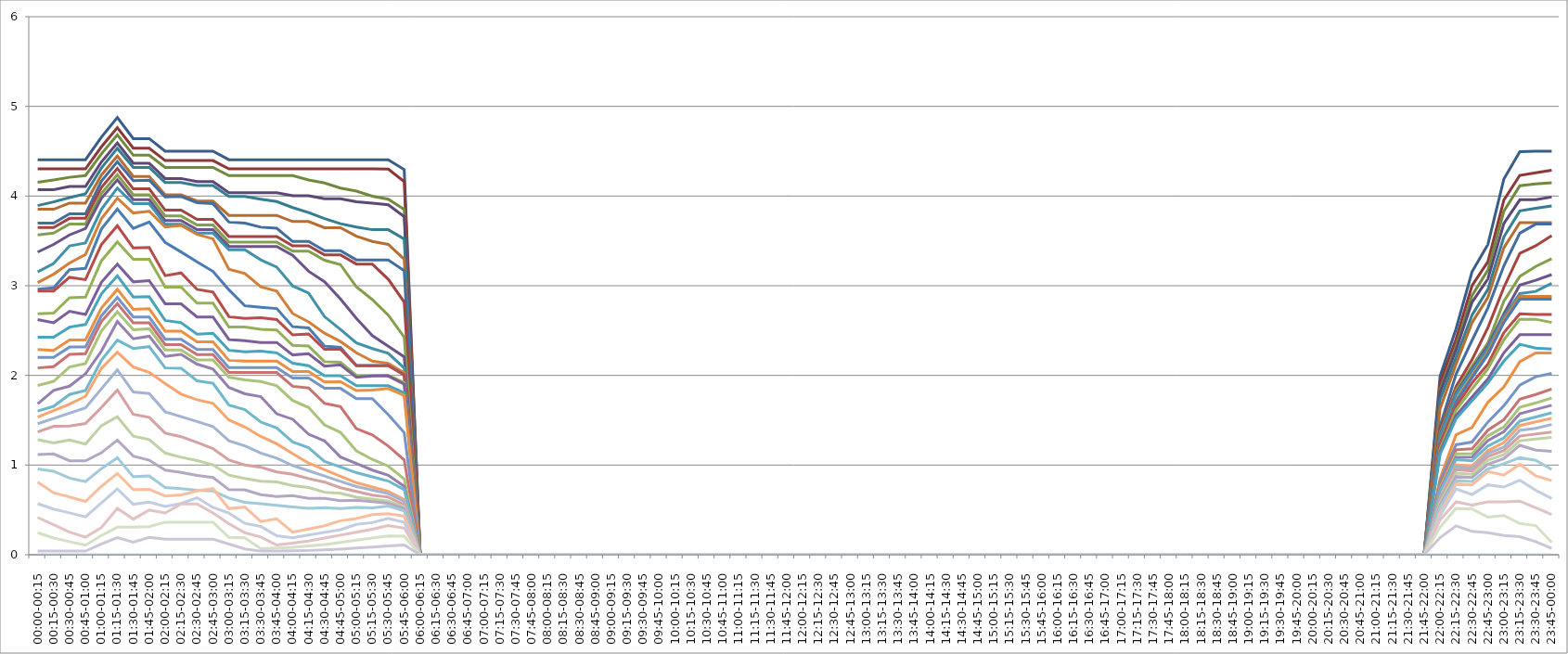
| Category | Series 0 | Series 1 | Series 2 | Series 3 | Series 4 | Series 5 | Series 6 | Series 7 | Series 8 | Series 9 | Series 10 | Series 11 | Series 12 | Series 13 | Series 14 | Series 15 | Series 16 | Series 17 | Series 18 | Series 19 | Series 20 | Series 21 | Series 22 | Series 23 | Series 24 | Series 25 | Series 26 | Series 27 | Series 28 | Series 29 | Series 30 | Series 31 | Series 32 | Series 33 | Series 34 |
|---|---|---|---|---|---|---|---|---|---|---|---|---|---|---|---|---|---|---|---|---|---|---|---|---|---|---|---|---|---|---|---|---|---|---|---|
| 00:00-00:15 | 4.405 | 4.303 | 4.152 | 4.072 | 3.894 | 3.853 | 3.699 | 3.65 | 3.568 | 3.375 | 3.154 | 3.035 | 2.962 | 2.941 | 2.686 | 2.623 | 2.427 | 2.289 | 2.201 | 2.083 | 1.886 | 1.681 | 1.602 | 1.535 | 1.461 | 1.37 | 1.283 | 1.116 | 0.958 | 0.809 | 0.569 | 0.416 | 0.245 | 0.04 | 0 |
| 00:15-00:30 | 4.405 | 4.303 | 4.18 | 4.072 | 3.934 | 3.853 | 3.699 | 3.65 | 3.587 | 3.46 | 3.248 | 3.128 | 2.977 | 2.941 | 2.694 | 2.587 | 2.427 | 2.278 | 2.201 | 2.098 | 1.934 | 1.833 | 1.655 | 1.608 | 1.52 | 1.433 | 1.246 | 1.124 | 0.932 | 0.692 | 0.51 | 0.334 | 0.186 | 0.04 | 0 |
| 00:30-00:45 | 4.405 | 4.303 | 4.209 | 4.106 | 3.983 | 3.922 | 3.801 | 3.752 | 3.688 | 3.567 | 3.444 | 3.254 | 3.179 | 3.094 | 2.866 | 2.715 | 2.538 | 2.395 | 2.316 | 2.234 | 2.093 | 1.88 | 1.787 | 1.68 | 1.579 | 1.437 | 1.281 | 1.048 | 0.854 | 0.643 | 0.466 | 0.251 | 0.146 | 0.04 | 0 |
| 00:45-01:00 | 4.405 | 4.303 | 4.229 | 4.106 | 4.024 | 3.922 | 3.801 | 3.752 | 3.688 | 3.638 | 3.476 | 3.347 | 3.193 | 3.068 | 2.873 | 2.679 | 2.567 | 2.395 | 2.316 | 2.242 | 2.132 | 2.018 | 1.832 | 1.767 | 1.638 | 1.463 | 1.234 | 1.046 | 0.815 | 0.595 | 0.423 | 0.196 | 0.106 | 0.04 | 0 |
| 01:00-01:15 | 4.656 | 4.549 | 4.471 | 4.381 | 4.312 | 4.234 | 4.165 | 4.096 | 4.028 | 3.974 | 3.853 | 3.747 | 3.632 | 3.459 | 3.278 | 3.039 | 2.909 | 2.751 | 2.665 | 2.6 | 2.496 | 2.27 | 2.17 | 2.078 | 1.85 | 1.642 | 1.44 | 1.137 | 0.96 | 0.763 | 0.577 | 0.303 | 0.215 | 0.12 | 0 |
| 01:15-01:30 | 4.876 | 4.763 | 4.682 | 4.591 | 4.532 | 4.448 | 4.382 | 4.307 | 4.238 | 4.18 | 4.09 | 3.977 | 3.854 | 3.67 | 3.488 | 3.241 | 3.111 | 2.959 | 2.869 | 2.801 | 2.711 | 2.602 | 2.393 | 2.26 | 2.062 | 1.837 | 1.539 | 1.279 | 1.082 | 0.906 | 0.734 | 0.518 | 0.307 | 0.19 | 0 |
| 01:30-01:45 | 4.641 | 4.533 | 4.456 | 4.366 | 4.32 | 4.219 | 4.173 | 4.081 | 4.013 | 3.959 | 3.915 | 3.811 | 3.639 | 3.422 | 3.296 | 3.043 | 2.873 | 2.736 | 2.65 | 2.586 | 2.509 | 2.409 | 2.3 | 2.094 | 1.815 | 1.565 | 1.322 | 1.101 | 0.87 | 0.727 | 0.563 | 0.397 | 0.309 | 0.14 | 0 |
| 01:45-02:00 | 4.641 | 4.533 | 4.456 | 4.366 | 4.32 | 4.219 | 4.177 | 4.081 | 4.013 | 3.959 | 3.915 | 3.831 | 3.71 | 3.426 | 3.296 | 3.057 | 2.877 | 2.744 | 2.65 | 2.586 | 2.52 | 2.437 | 2.32 | 2.036 | 1.798 | 1.532 | 1.285 | 1.055 | 0.879 | 0.73 | 0.586 | 0.498 | 0.313 | 0.194 | 0 |
| 02:00-02:15 | 4.499 | 4.395 | 4.319 | 4.196 | 4.152 | 4.013 | 3.99 | 3.842 | 3.778 | 3.726 | 3.685 | 3.654 | 3.483 | 3.113 | 2.985 | 2.799 | 2.613 | 2.492 | 2.404 | 2.344 | 2.283 | 2.212 | 2.083 | 1.908 | 1.595 | 1.356 | 1.135 | 0.943 | 0.75 | 0.655 | 0.539 | 0.465 | 0.363 | 0.174 | 0 |
| 02:15-02:30 | 4.499 | 4.395 | 4.319 | 4.196 | 4.152 | 4.013 | 3.995 | 3.842 | 3.778 | 3.726 | 3.685 | 3.673 | 3.377 | 3.143 | 2.985 | 2.799 | 2.588 | 2.492 | 2.404 | 2.344 | 2.283 | 2.234 | 2.08 | 1.791 | 1.54 | 1.317 | 1.088 | 0.917 | 0.737 | 0.667 | 0.572 | 0.566 | 0.363 | 0.174 | 0 |
| 02:30-02:45 | 4.499 | 4.395 | 4.319 | 4.162 | 4.118 | 3.945 | 3.926 | 3.74 | 3.677 | 3.626 | 3.586 | 3.572 | 3.267 | 2.959 | 2.806 | 2.652 | 2.459 | 2.375 | 2.289 | 2.231 | 2.173 | 2.126 | 1.94 | 1.729 | 1.485 | 1.253 | 1.05 | 0.885 | 0.718 | 0.711 | 0.636 | 0.566 | 0.363 | 0.174 | 0 |
| 02:45-03:00 | 4.499 | 4.395 | 4.319 | 4.162 | 4.118 | 3.945 | 3.915 | 3.74 | 3.677 | 3.626 | 3.586 | 3.523 | 3.16 | 2.929 | 2.806 | 2.652 | 2.469 | 2.375 | 2.289 | 2.231 | 2.173 | 2.071 | 1.913 | 1.689 | 1.43 | 1.184 | 1.003 | 0.862 | 0.712 | 0.738 | 0.528 | 0.465 | 0.363 | 0.174 | 0 |
| 03:00-03:15 | 4.405 | 4.303 | 4.229 | 4.038 | 3.995 | 3.784 | 3.71 | 3.548 | 3.486 | 3.438 | 3.4 | 3.184 | 2.954 | 2.654 | 2.539 | 2.4 | 2.281 | 2.168 | 2.086 | 2.032 | 1.979 | 1.865 | 1.668 | 1.503 | 1.27 | 1.055 | 0.888 | 0.726 | 0.632 | 0.514 | 0.464 | 0.346 | 0.193 | 0.119 | 0 |
| 03:15-03:30 | 4.405 | 4.303 | 4.229 | 4.038 | 3.995 | 3.784 | 3.699 | 3.548 | 3.486 | 3.438 | 3.4 | 3.136 | 2.777 | 2.635 | 2.539 | 2.386 | 2.262 | 2.161 | 2.086 | 2.032 | 1.951 | 1.795 | 1.618 | 1.425 | 1.214 | 1.002 | 0.85 | 0.723 | 0.585 | 0.532 | 0.35 | 0.246 | 0.189 | 0.065 | 0 |
| 03:30-03:45 | 4.405 | 4.303 | 4.229 | 4.038 | 3.965 | 3.784 | 3.653 | 3.548 | 3.486 | 3.438 | 3.289 | 2.988 | 2.76 | 2.643 | 2.514 | 2.368 | 2.27 | 2.161 | 2.086 | 2.032 | 1.931 | 1.763 | 1.479 | 1.319 | 1.134 | 0.976 | 0.82 | 0.67 | 0.568 | 0.37 | 0.316 | 0.198 | 0.066 | 0.04 | 0 |
| 03:45-04:00 | 4.405 | 4.303 | 4.229 | 4.038 | 3.939 | 3.784 | 3.642 | 3.548 | 3.486 | 3.438 | 3.208 | 2.939 | 2.746 | 2.623 | 2.506 | 2.368 | 2.251 | 2.161 | 2.086 | 2.032 | 1.884 | 1.572 | 1.413 | 1.238 | 1.077 | 0.923 | 0.812 | 0.65 | 0.551 | 0.4 | 0.212 | 0.108 | 0.074 | 0.04 | 0 |
| 04:00-04:15 | 4.405 | 4.303 | 4.229 | 4.004 | 3.872 | 3.716 | 3.493 | 3.446 | 3.385 | 3.338 | 2.998 | 2.69 | 2.543 | 2.452 | 2.334 | 2.228 | 2.137 | 2.043 | 1.971 | 1.879 | 1.721 | 1.511 | 1.259 | 1.129 | 0.995 | 0.898 | 0.771 | 0.659 | 0.533 | 0.251 | 0.189 | 0.13 | 0.082 | 0.044 | 0 |
| 04:15-04:30 | 4.405 | 4.303 | 4.18 | 4.004 | 3.815 | 3.716 | 3.493 | 3.446 | 3.385 | 3.161 | 2.918 | 2.597 | 2.529 | 2.463 | 2.327 | 2.243 | 2.108 | 2.043 | 1.971 | 1.86 | 1.642 | 1.344 | 1.194 | 1.021 | 0.937 | 0.85 | 0.75 | 0.629 | 0.516 | 0.287 | 0.219 | 0.152 | 0.098 | 0.048 | 0 |
| 04:30-04:45 | 4.405 | 4.303 | 4.146 | 3.97 | 3.748 | 3.647 | 3.391 | 3.343 | 3.284 | 3.045 | 2.655 | 2.471 | 2.327 | 2.291 | 2.155 | 2.103 | 1.996 | 1.926 | 1.856 | 1.688 | 1.447 | 1.27 | 1.041 | 0.949 | 0.878 | 0.81 | 0.697 | 0.627 | 0.525 | 0.323 | 0.25 | 0.185 | 0.114 | 0.056 | 0 |
| 04:45-05:00 | 4.405 | 4.303 | 4.089 | 3.97 | 3.692 | 3.647 | 3.391 | 3.343 | 3.235 | 2.853 | 2.513 | 2.378 | 2.312 | 2.291 | 2.147 | 2.118 | 1.996 | 1.93 | 1.856 | 1.651 | 1.365 | 1.09 | 0.978 | 0.876 | 0.819 | 0.748 | 0.685 | 0.603 | 0.514 | 0.379 | 0.28 | 0.218 | 0.138 | 0.063 | 0 |
| 05:00-05:15 | 4.405 | 4.303 | 4.055 | 3.936 | 3.655 | 3.552 | 3.288 | 3.241 | 2.987 | 2.635 | 2.361 | 2.252 | 2.11 | 2.108 | 2 | 1.979 | 1.885 | 1.831 | 1.741 | 1.406 | 1.158 | 1.017 | 0.915 | 0.804 | 0.76 | 0.706 | 0.642 | 0.609 | 0.528 | 0.403 | 0.338 | 0.251 | 0.162 | 0.075 | 0 |
| 05:15-05:30 | 4.405 | 4.303 | 3.998 | 3.922 | 3.625 | 3.495 | 3.288 | 3.241 | 2.845 | 2.443 | 2.299 | 2.159 | 2.11 | 2.108 | 2 | 1.993 | 1.885 | 1.835 | 1.741 | 1.336 | 1.063 | 0.944 | 0.868 | 0.755 | 0.721 | 0.664 | 0.62 | 0.591 | 0.523 | 0.446 | 0.358 | 0.284 | 0.186 | 0.086 | 0 |
| 05:30-05:45 | 4.405 | 4.3 | 3.965 | 3.902 | 3.625 | 3.461 | 3.288 | 3.072 | 2.673 | 2.325 | 2.246 | 2.134 | 2.11 | 2.108 | 2.003 | 1.993 | 1.885 | 1.853 | 1.562 | 1.212 | 0.988 | 0.887 | 0.822 | 0.707 | 0.681 | 0.643 | 0.598 | 0.574 | 0.543 | 0.458 | 0.406 | 0.325 | 0.21 | 0.098 | 0 |
| 05:45-06:00 | 4.296 | 4.162 | 3.851 | 3.771 | 3.52 | 3.296 | 3.167 | 2.818 | 2.426 | 2.207 | 2.082 | 2.029 | 2.006 | 2.004 | 1.92 | 1.902 | 1.805 | 1.774 | 1.362 | 1.058 | 0.844 | 0.763 | 0.725 | 0.614 | 0.595 | 0.557 | 0.536 | 0.514 | 0.487 | 0.43 | 0.361 | 0.297 | 0.207 | 0.11 | 0 |
| 06:00-06:15 | 0 | 0 | 0 | 0 | 0 | 0 | 0 | 0 | 0 | 0 | 0 | 0 | 0 | 0 | 0 | 0 | 0 | 0 | 0 | 0 | 0 | 0 | 0 | 0 | 0 | 0 | 0 | 0 | 0 | 0 | 0 | 0 | 0 | 0 | 0 |
| 06:15-06:30 | 0 | 0 | 0 | 0 | 0 | 0 | 0 | 0 | 0 | 0 | 0 | 0 | 0 | 0 | 0 | 0 | 0 | 0 | 0 | 0 | 0 | 0 | 0 | 0 | 0 | 0 | 0 | 0 | 0 | 0 | 0 | 0 | 0 | 0 | 0 |
| 06:30-06:45 | 0 | 0 | 0 | 0 | 0 | 0 | 0 | 0 | 0 | 0 | 0 | 0 | 0 | 0 | 0 | 0 | 0 | 0 | 0 | 0 | 0 | 0 | 0 | 0 | 0 | 0 | 0 | 0 | 0 | 0 | 0 | 0 | 0 | 0 | 0 |
| 06:45-07:00 | 0 | 0 | 0 | 0 | 0 | 0 | 0 | 0 | 0 | 0 | 0 | 0 | 0 | 0 | 0 | 0 | 0 | 0 | 0 | 0 | 0 | 0 | 0 | 0 | 0 | 0 | 0 | 0 | 0 | 0 | 0 | 0 | 0 | 0 | 0 |
| 07:00-07:15 | 0 | 0 | 0 | 0 | 0 | 0 | 0 | 0 | 0 | 0 | 0 | 0 | 0 | 0 | 0 | 0 | 0 | 0 | 0 | 0 | 0 | 0 | 0 | 0 | 0 | 0 | 0 | 0 | 0 | 0 | 0 | 0 | 0 | 0 | 0 |
| 07:15-07:30 | 0 | 0 | 0 | 0 | 0 | 0 | 0 | 0 | 0 | 0 | 0 | 0 | 0 | 0 | 0 | 0 | 0 | 0 | 0 | 0 | 0 | 0 | 0 | 0 | 0 | 0 | 0 | 0 | 0 | 0 | 0 | 0 | 0 | 0 | 0 |
| 07:30-07:45 | 0 | 0 | 0 | 0 | 0 | 0 | 0 | 0 | 0 | 0 | 0 | 0 | 0 | 0 | 0 | 0 | 0 | 0 | 0 | 0 | 0 | 0 | 0 | 0 | 0 | 0 | 0 | 0 | 0 | 0 | 0 | 0 | 0 | 0 | 0 |
| 07:45-08:00 | 0 | 0 | 0 | 0 | 0 | 0 | 0 | 0 | 0 | 0 | 0 | 0 | 0 | 0 | 0 | 0 | 0 | 0 | 0 | 0 | 0 | 0 | 0 | 0 | 0 | 0 | 0 | 0 | 0 | 0 | 0 | 0 | 0 | 0 | 0 |
| 08:00-08:15 | 0 | 0 | 0 | 0 | 0 | 0 | 0 | 0 | 0 | 0 | 0 | 0 | 0 | 0 | 0 | 0 | 0 | 0 | 0 | 0 | 0 | 0 | 0 | 0 | 0 | 0 | 0 | 0 | 0 | 0 | 0 | 0 | 0 | 0 | 0 |
| 08:15-08:30 | 0 | 0 | 0 | 0 | 0 | 0 | 0 | 0 | 0 | 0 | 0 | 0 | 0 | 0 | 0 | 0 | 0 | 0 | 0 | 0 | 0 | 0 | 0 | 0 | 0 | 0 | 0 | 0 | 0 | 0 | 0 | 0 | 0 | 0 | 0 |
| 08:30-08:45 | 0 | 0 | 0 | 0 | 0 | 0 | 0 | 0 | 0 | 0 | 0 | 0 | 0 | 0 | 0 | 0 | 0 | 0 | 0 | 0 | 0 | 0 | 0 | 0 | 0 | 0 | 0 | 0 | 0 | 0 | 0 | 0 | 0 | 0 | 0 |
| 08:45-09:00 | 0 | 0 | 0 | 0 | 0 | 0 | 0 | 0 | 0 | 0 | 0 | 0 | 0 | 0 | 0 | 0 | 0 | 0 | 0 | 0 | 0 | 0 | 0 | 0 | 0 | 0 | 0 | 0 | 0 | 0 | 0 | 0 | 0 | 0 | 0 |
| 09:00-09:15 | 0 | 0 | 0 | 0 | 0 | 0 | 0 | 0 | 0 | 0 | 0 | 0 | 0 | 0 | 0 | 0 | 0 | 0 | 0 | 0 | 0 | 0 | 0 | 0 | 0 | 0 | 0 | 0 | 0 | 0 | 0 | 0 | 0 | 0 | 0 |
| 09:15-09:30 | 0 | 0 | 0 | 0 | 0 | 0 | 0 | 0 | 0 | 0 | 0 | 0 | 0 | 0 | 0 | 0 | 0 | 0 | 0 | 0 | 0 | 0 | 0 | 0 | 0 | 0 | 0 | 0 | 0 | 0 | 0 | 0 | 0 | 0 | 0 |
| 09:30-09:45 | 0 | 0 | 0 | 0 | 0 | 0 | 0 | 0 | 0 | 0 | 0 | 0 | 0 | 0 | 0 | 0 | 0 | 0 | 0 | 0 | 0 | 0 | 0 | 0 | 0 | 0 | 0 | 0 | 0 | 0 | 0 | 0 | 0 | 0 | 0 |
| 09:45-10:00 | 0 | 0 | 0 | 0 | 0 | 0 | 0 | 0 | 0 | 0 | 0 | 0 | 0 | 0 | 0 | 0 | 0 | 0 | 0 | 0 | 0 | 0 | 0 | 0 | 0 | 0 | 0 | 0 | 0 | 0 | 0 | 0 | 0 | 0 | 0 |
| 10:00-10:15 | 0 | 0 | 0 | 0 | 0 | 0 | 0 | 0 | 0 | 0 | 0 | 0 | 0 | 0 | 0 | 0 | 0 | 0 | 0 | 0 | 0 | 0 | 0 | 0 | 0 | 0 | 0 | 0 | 0 | 0 | 0 | 0 | 0 | 0 | 0 |
| 10:15-10:30 | 0 | 0 | 0 | 0 | 0 | 0 | 0 | 0 | 0 | 0 | 0 | 0 | 0 | 0 | 0 | 0 | 0 | 0 | 0 | 0 | 0 | 0 | 0 | 0 | 0 | 0 | 0 | 0 | 0 | 0 | 0 | 0 | 0 | 0 | 0 |
| 10:30-10:45 | 0 | 0 | 0 | 0 | 0 | 0 | 0 | 0 | 0 | 0 | 0 | 0 | 0 | 0 | 0 | 0 | 0 | 0 | 0 | 0 | 0 | 0 | 0 | 0 | 0 | 0 | 0 | 0 | 0 | 0 | 0 | 0 | 0 | 0 | 0 |
| 10:45-11:00 | 0 | 0 | 0 | 0 | 0 | 0 | 0 | 0 | 0 | 0 | 0 | 0 | 0 | 0 | 0 | 0 | 0 | 0 | 0 | 0 | 0 | 0 | 0 | 0 | 0 | 0 | 0 | 0 | 0 | 0 | 0 | 0 | 0 | 0 | 0 |
| 11:00-11:15 | 0 | 0 | 0 | 0 | 0 | 0 | 0 | 0 | 0 | 0 | 0 | 0 | 0 | 0 | 0 | 0 | 0 | 0 | 0 | 0 | 0 | 0 | 0 | 0 | 0 | 0 | 0 | 0 | 0 | 0 | 0 | 0 | 0 | 0 | 0 |
| 11:15-11:30 | 0 | 0 | 0 | 0 | 0 | 0 | 0 | 0 | 0 | 0 | 0 | 0 | 0 | 0 | 0 | 0 | 0 | 0 | 0 | 0 | 0 | 0 | 0 | 0 | 0 | 0 | 0 | 0 | 0 | 0 | 0 | 0 | 0 | 0 | 0 |
| 11:30-11:45 | 0 | 0 | 0 | 0 | 0 | 0 | 0 | 0 | 0 | 0 | 0 | 0 | 0 | 0 | 0 | 0 | 0 | 0 | 0 | 0 | 0 | 0 | 0 | 0 | 0 | 0 | 0 | 0 | 0 | 0 | 0 | 0 | 0 | 0 | 0 |
| 11:45-12:00 | 0 | 0 | 0 | 0 | 0 | 0 | 0 | 0 | 0 | 0 | 0 | 0 | 0 | 0 | 0 | 0 | 0 | 0 | 0 | 0 | 0 | 0 | 0 | 0 | 0 | 0 | 0 | 0 | 0 | 0 | 0 | 0 | 0 | 0 | 0 |
| 12:00-12:15 | 0 | 0 | 0 | 0 | 0 | 0 | 0 | 0 | 0 | 0 | 0 | 0 | 0 | 0 | 0 | 0 | 0 | 0 | 0 | 0 | 0 | 0 | 0 | 0 | 0 | 0 | 0 | 0 | 0 | 0 | 0 | 0 | 0 | 0 | 0 |
| 12:15-12:30 | 0 | 0 | 0 | 0 | 0 | 0 | 0 | 0 | 0 | 0 | 0 | 0 | 0 | 0 | 0 | 0 | 0 | 0 | 0 | 0 | 0 | 0 | 0 | 0 | 0 | 0 | 0 | 0 | 0 | 0 | 0 | 0 | 0 | 0 | 0 |
| 12:30-12:45 | 0 | 0 | 0 | 0 | 0 | 0 | 0 | 0 | 0 | 0 | 0 | 0 | 0 | 0 | 0 | 0 | 0 | 0 | 0 | 0 | 0 | 0 | 0 | 0 | 0 | 0 | 0 | 0 | 0 | 0 | 0 | 0 | 0 | 0 | 0 |
| 12:45-13:00 | 0 | 0 | 0 | 0 | 0 | 0 | 0 | 0 | 0 | 0 | 0 | 0 | 0 | 0 | 0 | 0 | 0 | 0 | 0 | 0 | 0 | 0 | 0 | 0 | 0 | 0 | 0 | 0 | 0 | 0 | 0 | 0 | 0 | 0 | 0 |
| 13:00-13:15 | 0 | 0 | 0 | 0 | 0 | 0 | 0 | 0 | 0 | 0 | 0 | 0 | 0 | 0 | 0 | 0 | 0 | 0 | 0 | 0 | 0 | 0 | 0 | 0 | 0 | 0 | 0 | 0 | 0 | 0 | 0 | 0 | 0 | 0 | 0 |
| 13:15-13:30 | 0 | 0 | 0 | 0 | 0 | 0 | 0 | 0 | 0 | 0 | 0 | 0 | 0 | 0 | 0 | 0 | 0 | 0 | 0 | 0 | 0 | 0 | 0 | 0 | 0 | 0 | 0 | 0 | 0 | 0 | 0 | 0 | 0 | 0 | 0 |
| 13:30-13:45 | 0 | 0 | 0 | 0 | 0 | 0 | 0 | 0 | 0 | 0 | 0 | 0 | 0 | 0 | 0 | 0 | 0 | 0 | 0 | 0 | 0 | 0 | 0 | 0 | 0 | 0 | 0 | 0 | 0 | 0 | 0 | 0 | 0 | 0 | 0 |
| 13:45-14:00 | 0 | 0 | 0 | 0 | 0 | 0 | 0 | 0 | 0 | 0 | 0 | 0 | 0 | 0 | 0 | 0 | 0 | 0 | 0 | 0 | 0 | 0 | 0 | 0 | 0 | 0 | 0 | 0 | 0 | 0 | 0 | 0 | 0 | 0 | 0 |
| 14:00-14:15 | 0 | 0 | 0 | 0 | 0 | 0 | 0 | 0 | 0 | 0 | 0 | 0 | 0 | 0 | 0 | 0 | 0 | 0 | 0 | 0 | 0 | 0 | 0 | 0 | 0 | 0 | 0 | 0 | 0 | 0 | 0 | 0 | 0 | 0 | 0 |
| 14:15-14:30 | 0 | 0 | 0 | 0 | 0 | 0 | 0 | 0 | 0 | 0 | 0 | 0 | 0 | 0 | 0 | 0 | 0 | 0 | 0 | 0 | 0 | 0 | 0 | 0 | 0 | 0 | 0 | 0 | 0 | 0 | 0 | 0 | 0 | 0 | 0 |
| 14:30-14:45 | 0 | 0 | 0 | 0 | 0 | 0 | 0 | 0 | 0 | 0 | 0 | 0 | 0 | 0 | 0 | 0 | 0 | 0 | 0 | 0 | 0 | 0 | 0 | 0 | 0 | 0 | 0 | 0 | 0 | 0 | 0 | 0 | 0 | 0 | 0 |
| 14:45-15:00 | 0 | 0 | 0 | 0 | 0 | 0 | 0 | 0 | 0 | 0 | 0 | 0 | 0 | 0 | 0 | 0 | 0 | 0 | 0 | 0 | 0 | 0 | 0 | 0 | 0 | 0 | 0 | 0 | 0 | 0 | 0 | 0 | 0 | 0 | 0 |
| 15:00-15:15 | 0 | 0 | 0 | 0 | 0 | 0 | 0 | 0 | 0 | 0 | 0 | 0 | 0 | 0 | 0 | 0 | 0 | 0 | 0 | 0 | 0 | 0 | 0 | 0 | 0 | 0 | 0 | 0 | 0 | 0 | 0 | 0 | 0 | 0 | 0 |
| 15:15-15:30 | 0 | 0 | 0 | 0 | 0 | 0 | 0 | 0 | 0 | 0 | 0 | 0 | 0 | 0 | 0 | 0 | 0 | 0 | 0 | 0 | 0 | 0 | 0 | 0 | 0 | 0 | 0 | 0 | 0 | 0 | 0 | 0 | 0 | 0 | 0 |
| 15:30-15:45 | 0 | 0 | 0 | 0 | 0 | 0 | 0 | 0 | 0 | 0 | 0 | 0 | 0 | 0 | 0 | 0 | 0 | 0 | 0 | 0 | 0 | 0 | 0 | 0 | 0 | 0 | 0 | 0 | 0 | 0 | 0 | 0 | 0 | 0 | 0 |
| 15:45-16:00 | 0 | 0 | 0 | 0 | 0 | 0 | 0 | 0 | 0 | 0 | 0 | 0 | 0 | 0 | 0 | 0 | 0 | 0 | 0 | 0 | 0 | 0 | 0 | 0 | 0 | 0 | 0 | 0 | 0 | 0 | 0 | 0 | 0 | 0 | 0 |
| 16:00-16:15 | 0 | 0 | 0 | 0 | 0 | 0 | 0 | 0 | 0 | 0 | 0 | 0 | 0 | 0 | 0 | 0 | 0 | 0 | 0 | 0 | 0 | 0 | 0 | 0 | 0 | 0 | 0 | 0 | 0 | 0 | 0 | 0 | 0 | 0 | 0 |
| 16:15-16:30 | 0 | 0 | 0 | 0 | 0 | 0 | 0 | 0 | 0 | 0 | 0 | 0 | 0 | 0 | 0 | 0 | 0 | 0 | 0 | 0 | 0 | 0 | 0 | 0 | 0 | 0 | 0 | 0 | 0 | 0 | 0 | 0 | 0 | 0 | 0 |
| 16:30-16:45 | 0 | 0 | 0 | 0 | 0 | 0 | 0 | 0 | 0 | 0 | 0 | 0 | 0 | 0 | 0 | 0 | 0 | 0 | 0 | 0 | 0 | 0 | 0 | 0 | 0 | 0 | 0 | 0 | 0 | 0 | 0 | 0 | 0 | 0 | 0 |
| 16:45-17:00 | 0 | 0 | 0 | 0 | 0 | 0 | 0 | 0 | 0 | 0 | 0 | 0 | 0 | 0 | 0 | 0 | 0 | 0 | 0 | 0 | 0 | 0 | 0 | 0 | 0 | 0 | 0 | 0 | 0 | 0 | 0 | 0 | 0 | 0 | 0 |
| 17:00-17:15 | 0 | 0 | 0 | 0 | 0 | 0 | 0 | 0 | 0 | 0 | 0 | 0 | 0 | 0 | 0 | 0 | 0 | 0 | 0 | 0 | 0 | 0 | 0 | 0 | 0 | 0 | 0 | 0 | 0 | 0 | 0 | 0 | 0 | 0 | 0 |
| 17:15-17:30 | 0 | 0 | 0 | 0 | 0 | 0 | 0 | 0 | 0 | 0 | 0 | 0 | 0 | 0 | 0 | 0 | 0 | 0 | 0 | 0 | 0 | 0 | 0 | 0 | 0 | 0 | 0 | 0 | 0 | 0 | 0 | 0 | 0 | 0 | 0 |
| 17:30-17:45 | 0 | 0 | 0 | 0 | 0 | 0 | 0 | 0 | 0 | 0 | 0 | 0 | 0 | 0 | 0 | 0 | 0 | 0 | 0 | 0 | 0 | 0 | 0 | 0 | 0 | 0 | 0 | 0 | 0 | 0 | 0 | 0 | 0 | 0 | 0 |
| 17:45-18:00 | 0 | 0 | 0 | 0 | 0 | 0 | 0 | 0 | 0 | 0 | 0 | 0 | 0 | 0 | 0 | 0 | 0 | 0 | 0 | 0 | 0 | 0 | 0 | 0 | 0 | 0 | 0 | 0 | 0 | 0 | 0 | 0 | 0 | 0 | 0 |
| 18:00-18:15 | 0 | 0 | 0 | 0 | 0 | 0 | 0 | 0 | 0 | 0 | 0 | 0 | 0 | 0 | 0 | 0 | 0 | 0 | 0 | 0 | 0 | 0 | 0 | 0 | 0 | 0 | 0 | 0 | 0 | 0 | 0 | 0 | 0 | 0 | 0 |
| 18:15-18:30 | 0 | 0 | 0 | 0 | 0 | 0 | 0 | 0 | 0 | 0 | 0 | 0 | 0 | 0 | 0 | 0 | 0 | 0 | 0 | 0 | 0 | 0 | 0 | 0 | 0 | 0 | 0 | 0 | 0 | 0 | 0 | 0 | 0 | 0 | 0 |
| 18:30-18:45 | 0 | 0 | 0 | 0 | 0 | 0 | 0 | 0 | 0 | 0 | 0 | 0 | 0 | 0 | 0 | 0 | 0 | 0 | 0 | 0 | 0 | 0 | 0 | 0 | 0 | 0 | 0 | 0 | 0 | 0 | 0 | 0 | 0 | 0 | 0 |
| 18:45-19:00 | 0 | 0 | 0 | 0 | 0 | 0 | 0 | 0 | 0 | 0 | 0 | 0 | 0 | 0 | 0 | 0 | 0 | 0 | 0 | 0 | 0 | 0 | 0 | 0 | 0 | 0 | 0 | 0 | 0 | 0 | 0 | 0 | 0 | 0 | 0 |
| 19:00-19:15 | 0 | 0 | 0 | 0 | 0 | 0 | 0 | 0 | 0 | 0 | 0 | 0 | 0 | 0 | 0 | 0 | 0 | 0 | 0 | 0 | 0 | 0 | 0 | 0 | 0 | 0 | 0 | 0 | 0 | 0 | 0 | 0 | 0 | 0 | 0 |
| 19:15-19:30 | 0 | 0 | 0 | 0 | 0 | 0 | 0 | 0 | 0 | 0 | 0 | 0 | 0 | 0 | 0 | 0 | 0 | 0 | 0 | 0 | 0 | 0 | 0 | 0 | 0 | 0 | 0 | 0 | 0 | 0 | 0 | 0 | 0 | 0 | 0 |
| 19:30-19:45 | 0 | 0 | 0 | 0 | 0 | 0 | 0 | 0 | 0 | 0 | 0 | 0 | 0 | 0 | 0 | 0 | 0 | 0 | 0 | 0 | 0 | 0 | 0 | 0 | 0 | 0 | 0 | 0 | 0 | 0 | 0 | 0 | 0 | 0 | 0 |
| 19:45-20:00 | 0 | 0 | 0 | 0 | 0 | 0 | 0 | 0 | 0 | 0 | 0 | 0 | 0 | 0 | 0 | 0 | 0 | 0 | 0 | 0 | 0 | 0 | 0 | 0 | 0 | 0 | 0 | 0 | 0 | 0 | 0 | 0 | 0 | 0 | 0 |
| 20:00-20:15 | 0 | 0 | 0 | 0 | 0 | 0 | 0 | 0 | 0 | 0 | 0 | 0 | 0 | 0 | 0 | 0 | 0 | 0 | 0 | 0 | 0 | 0 | 0 | 0 | 0 | 0 | 0 | 0 | 0 | 0 | 0 | 0 | 0 | 0 | 0 |
| 20:15-20:30 | 0 | 0 | 0 | 0 | 0 | 0 | 0 | 0 | 0 | 0 | 0 | 0 | 0 | 0 | 0 | 0 | 0 | 0 | 0 | 0 | 0 | 0 | 0 | 0 | 0 | 0 | 0 | 0 | 0 | 0 | 0 | 0 | 0 | 0 | 0 |
| 20:30-20:45 | 0 | 0 | 0 | 0 | 0 | 0 | 0 | 0 | 0 | 0 | 0 | 0 | 0 | 0 | 0 | 0 | 0 | 0 | 0 | 0 | 0 | 0 | 0 | 0 | 0 | 0 | 0 | 0 | 0 | 0 | 0 | 0 | 0 | 0 | 0 |
| 20:45-21:00 | 0 | 0 | 0 | 0 | 0 | 0 | 0 | 0 | 0 | 0 | 0 | 0 | 0 | 0 | 0 | 0 | 0 | 0 | 0 | 0 | 0 | 0 | 0 | 0 | 0 | 0 | 0 | 0 | 0 | 0 | 0 | 0 | 0 | 0 | 0 |
| 21:00-21:15 | 0 | 0 | 0 | 0 | 0 | 0 | 0 | 0 | 0 | 0 | 0 | 0 | 0 | 0 | 0 | 0 | 0 | 0 | 0 | 0 | 0 | 0 | 0 | 0 | 0 | 0 | 0 | 0 | 0 | 0 | 0 | 0 | 0 | 0 | 0 |
| 21:15-21:30 | 0 | 0 | 0 | 0 | 0 | 0 | 0 | 0 | 0 | 0 | 0 | 0 | 0 | 0 | 0 | 0 | 0 | 0 | 0 | 0 | 0 | 0 | 0 | 0 | 0 | 0 | 0 | 0 | 0 | 0 | 0 | 0 | 0 | 0 | 0 |
| 21:30-21:45 | 0 | 0 | 0 | 0 | 0 | 0 | 0 | 0 | 0 | 0 | 0 | 0 | 0 | 0 | 0 | 0 | 0 | 0 | 0 | 0 | 0 | 0 | 0 | 0 | 0 | 0 | 0 | 0 | 0 | 0 | 0 | 0 | 0 | 0 | 0 |
| 21:45-22:00 | 0 | 0 | 0 | 0 | 0 | 0 | 0 | 0 | 0 | 0 | 0 | 0 | 0 | 0 | 0 | 0 | 0 | 0 | 0 | 0 | 0 | 0 | 0 | 0 | 0 | 0 | 0 | 0 | 0 | 0 | 0 | 0 | 0 | 0 | 0 |
| 22:00-22:15 | 1.993 | 1.923 | 1.843 | 1.812 | 1.731 | 1.63 | 1.436 | 1.399 | 1.36 | 1.338 | 1.324 | 1.252 | 1.238 | 1.237 | 1.182 | 1.148 | 1.121 | 0.848 | 0.82 | 0.782 | 0.744 | 0.727 | 0.709 | 0.638 | 0.622 | 0.602 | 0.579 | 0.555 | 0.526 | 0.471 | 0.437 | 0.39 | 0.307 | 0.19 | 0 |
| 22:15-22:30 | 2.519 | 2.406 | 2.324 | 2.287 | 2.201 | 2.125 | 2.013 | 1.875 | 1.831 | 1.804 | 1.784 | 1.724 | 1.704 | 1.655 | 1.613 | 1.553 | 1.518 | 1.338 | 1.226 | 1.17 | 1.126 | 1.087 | 1.061 | 1.004 | 0.979 | 0.948 | 0.911 | 0.874 | 0.828 | 0.791 | 0.733 | 0.59 | 0.518 | 0.322 | 0 |
| 22:30-22:45 | 3.154 | 3 | 2.89 | 2.814 | 2.671 | 2.587 | 2.39 | 2.174 | 2.102 | 2.072 | 2.049 | 1.995 | 1.973 | 1.916 | 1.848 | 1.758 | 1.718 | 1.42 | 1.257 | 1.181 | 1.126 | 1.089 | 1.048 | 0.99 | 0.965 | 0.935 | 0.898 | 0.862 | 0.816 | 0.779 | 0.672 | 0.555 | 0.51 | 0.261 | 0 |
| 22:45-23:00 | 3.461 | 3.268 | 3.174 | 3.078 | 2.96 | 2.869 | 2.754 | 2.533 | 2.364 | 2.33 | 2.304 | 2.258 | 2.232 | 2.127 | 2.076 | 1.961 | 1.917 | 1.701 | 1.48 | 1.389 | 1.326 | 1.273 | 1.212 | 1.16 | 1.132 | 1.096 | 1.053 | 1.011 | 0.957 | 0.928 | 0.779 | 0.589 | 0.42 | 0.247 | 0 |
| 23:00-23:15 | 4.19 | 3.955 | 3.831 | 3.695 | 3.546 | 3.422 | 3.222 | 2.982 | 2.828 | 2.686 | 2.657 | 2.619 | 2.59 | 2.476 | 2.397 | 2.252 | 2.159 | 1.872 | 1.661 | 1.506 | 1.424 | 1.373 | 1.303 | 1.25 | 1.2 | 1.162 | 1.116 | 1.072 | 1.015 | 0.887 | 0.754 | 0.589 | 0.437 | 0.216 | 0 |
| 23:15-23:30 | 4.496 | 4.231 | 4.115 | 3.959 | 3.834 | 3.704 | 3.586 | 3.36 | 3.104 | 3.008 | 2.912 | 2.881 | 2.849 | 2.687 | 2.626 | 2.454 | 2.347 | 2.153 | 1.893 | 1.734 | 1.645 | 1.572 | 1.49 | 1.441 | 1.388 | 1.323 | 1.272 | 1.22 | 1.082 | 1.009 | 0.831 | 0.598 | 0.348 | 0.202 | 0 |
| 23:30-23:45 | 4.499 | 4.26 | 4.135 | 3.959 | 3.863 | 3.704 | 3.687 | 3.445 | 3.214 | 3.061 | 2.937 | 2.881 | 2.849 | 2.68 | 2.626 | 2.454 | 2.305 | 2.25 | 1.985 | 1.787 | 1.693 | 1.62 | 1.537 | 1.481 | 1.409 | 1.346 | 1.29 | 1.166 | 1.053 | 0.88 | 0.719 | 0.523 | 0.325 | 0.146 | 0 |
| 23:45-00:00 | 4.499 | 4.288 | 4.149 | 3.989 | 3.89 | 3.704 | 3.687 | 3.559 | 3.301 | 3.125 | 3.028 | 2.881 | 2.849 | 2.68 | 2.59 | 2.454 | 2.294 | 2.25 | 2.023 | 1.848 | 1.748 | 1.667 | 1.583 | 1.522 | 1.453 | 1.369 | 1.308 | 1.152 | 0.951 | 0.826 | 0.627 | 0.448 | 0.137 | 0.07 | 0 |